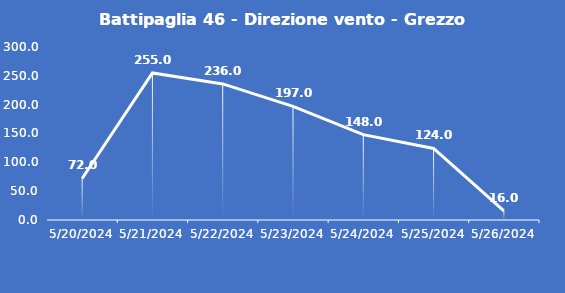
| Category | Battipaglia 46 - Direzione vento - Grezzo (°N) |
|---|---|
| 5/20/24 | 72 |
| 5/21/24 | 255 |
| 5/22/24 | 236 |
| 5/23/24 | 197 |
| 5/24/24 | 148 |
| 5/25/24 | 124 |
| 5/26/24 | 16 |